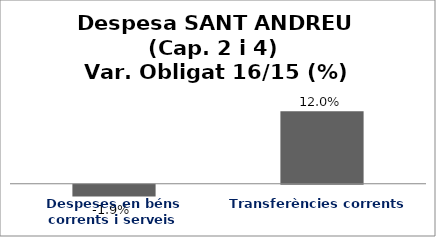
| Category | Series 0 |
|---|---|
| Despeses en béns corrents i serveis | -0.019 |
| Transferències corrents | 0.12 |